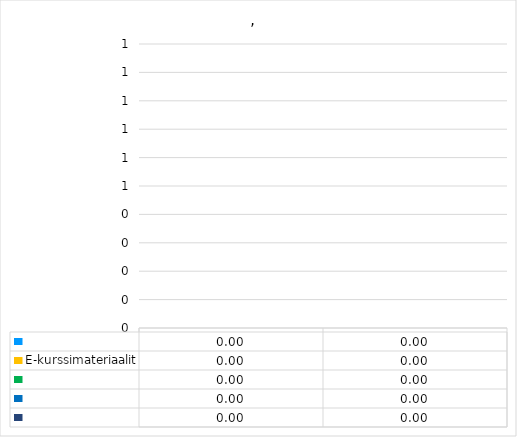
| Category | Series 3 | E-kurssimateriaalit | Series 5 | Series 6 | Series 10 |
|---|---|---|---|---|---|
| 0 | 0 | 0 | 0 | 0 | 0 |
| 1 | 0 | 0 | 0 | 0 | 0 |